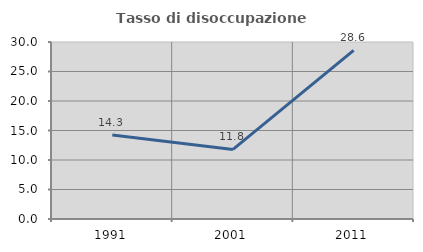
| Category | Tasso di disoccupazione giovanile  |
|---|---|
| 1991.0 | 14.253 |
| 2001.0 | 11.792 |
| 2011.0 | 28.571 |